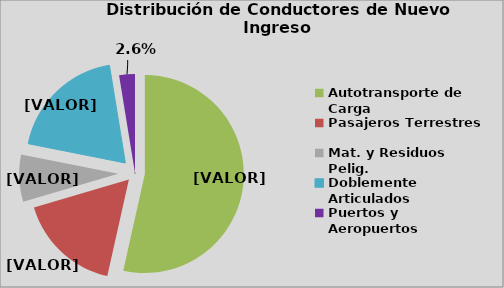
| Category | Series 0 |
|---|---|
| Autotransporte de Carga | 53.503 |
| Pasajeros Terrestres | 16.935 |
| Mat. y Residuos Pelig. | 7.695 |
| Doblemente Articulados | 19.292 |
| Puertos y Aeropuertos | 2.575 |